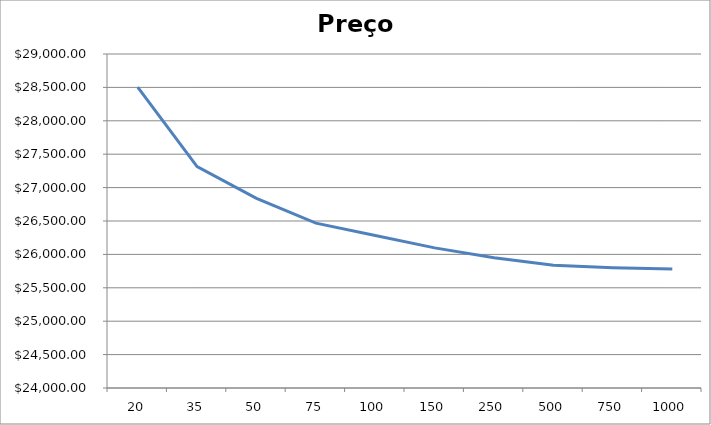
| Category | Preço p/carro |
|---|---|
| 20.0 | 28504.286 |
| 35.0 | 27314.082 |
| 50.0 | 26838 |
| 75.0 | 26467.714 |
| 100.0 | 26282.571 |
| 150.0 | 26097.429 |
| 250.0 | 25949.314 |
| 500.0 | 25838.229 |
| 750.0 | 25801.2 |
| 1000.0 | 25782.686 |